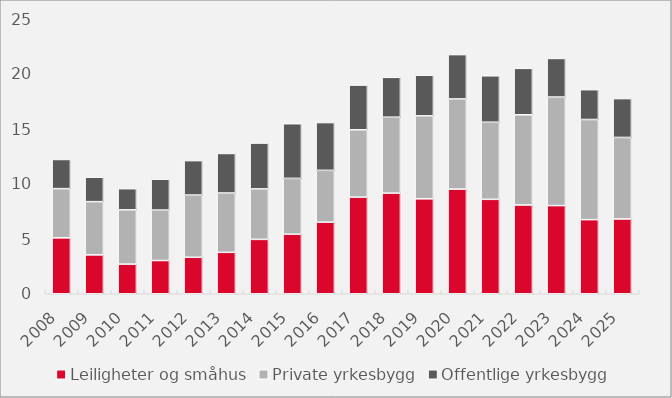
| Category | Leiligheter og småhus | Private yrkesbygg | Offentlige yrkesbygg |
|---|---|---|---|
| 2008.0 | 5.081 | 4.476 | 2.65 |
| 2009.0 | 3.535 | 4.84 | 2.222 |
| 2010.0 | 2.696 | 4.932 | 1.926 |
| 2011.0 | 3.022 | 4.587 | 2.806 |
| 2012.0 | 3.314 | 5.657 | 3.134 |
| 2013.0 | 3.764 | 5.394 | 3.596 |
| 2014.0 | 4.945 | 4.587 | 4.168 |
| 2015.0 | 5.413 | 5.074 | 4.972 |
| 2016.0 | 6.505 | 4.714 | 4.343 |
| 2017.0 | 8.78 | 6.125 | 4.066 |
| 2018.0 | 9.145 | 6.907 | 3.621 |
| 2019.0 | 8.632 | 7.541 | 3.696 |
| 2020.0 | 9.514 | 8.197 | 4.031 |
| 2021.0 | 8.584 | 7.011 | 4.221 |
| 2022.0 | 8.07 | 8.201 | 4.221 |
| 2023.0 | 8.015 | 9.867 | 3.51 |
| 2024.0 | 6.738 | 9.102 | 2.714 |
| 2025.0 | 6.801 | 7.408 | 3.531 |